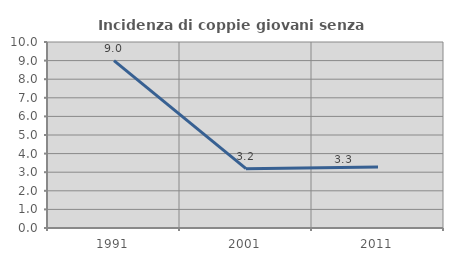
| Category | Incidenza di coppie giovani senza figli |
|---|---|
| 1991.0 | 8.995 |
| 2001.0 | 3.191 |
| 2011.0 | 3.284 |